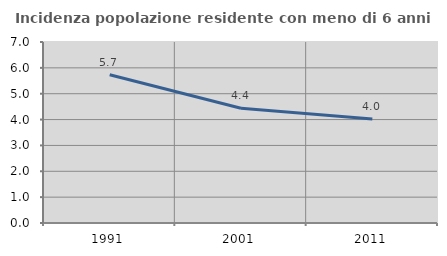
| Category | Incidenza popolazione residente con meno di 6 anni |
|---|---|
| 1991.0 | 5.735 |
| 2001.0 | 4.437 |
| 2011.0 | 4.021 |